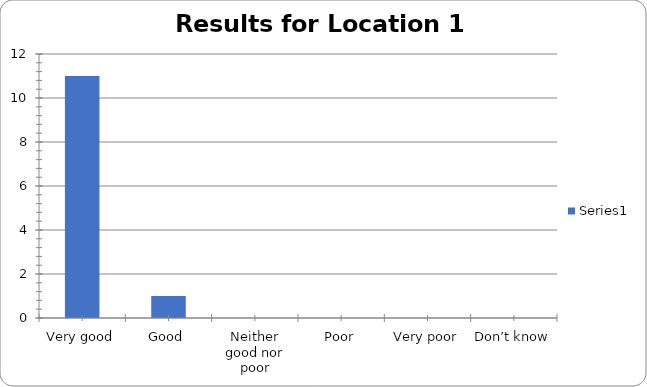
| Category | Series 0 |
|---|---|
| Very good | 11 |
| Good | 1 |
| Neither good nor poor | 0 |
| Poor | 0 |
| Very poor | 0 |
| Don’t know | 0 |